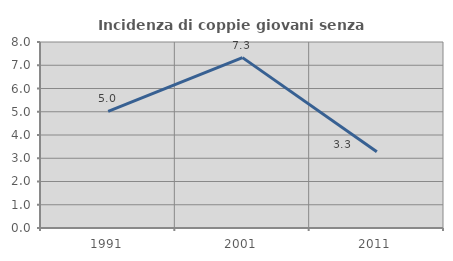
| Category | Incidenza di coppie giovani senza figli |
|---|---|
| 1991.0 | 5.014 |
| 2001.0 | 7.329 |
| 2011.0 | 3.279 |